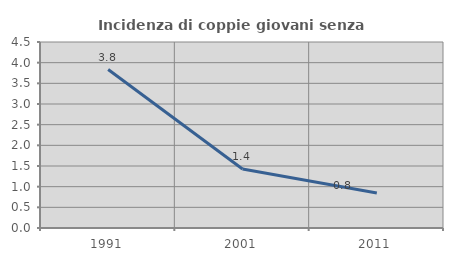
| Category | Incidenza di coppie giovani senza figli |
|---|---|
| 1991.0 | 3.833 |
| 2001.0 | 1.429 |
| 2011.0 | 0.847 |